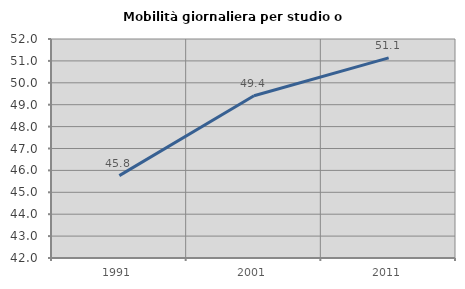
| Category | Mobilità giornaliera per studio o lavoro |
|---|---|
| 1991.0 | 45.762 |
| 2001.0 | 49.411 |
| 2011.0 | 51.141 |